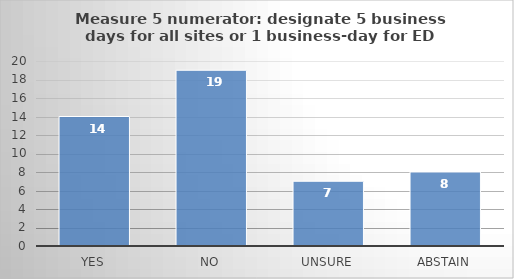
| Category | Series 0 |
|---|---|
| Yes | 14 |
| No | 19 |
| Unsure | 7 |
| Abstain | 8 |